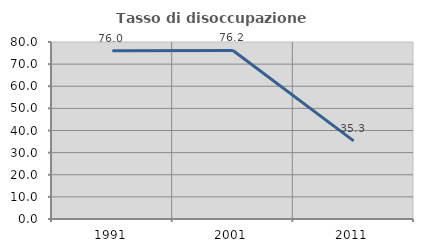
| Category | Tasso di disoccupazione giovanile  |
|---|---|
| 1991.0 | 76.027 |
| 2001.0 | 76.19 |
| 2011.0 | 35.294 |